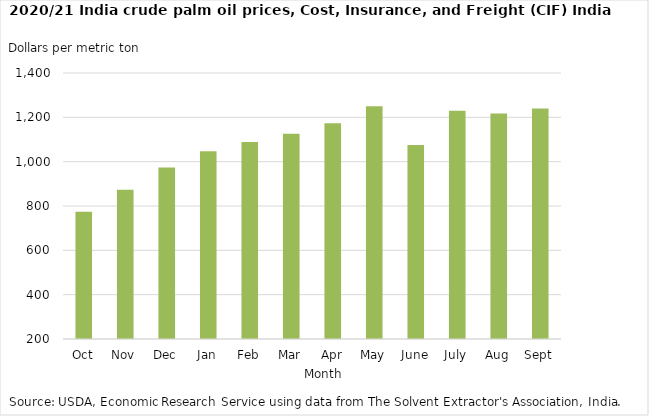
| Category | Crude palm oil |
|---|---|
| Oct | 774 |
| Nov | 873 |
| Dec | 974 |
| Jan | 1047 |
| Feb | 1089 |
| Mar | 1126 |
| Apr | 1173 |
| May | 1250 |
| June | 1075 |
| July | 1230 |
| Aug | 1217 |
| Sept | 1240 |